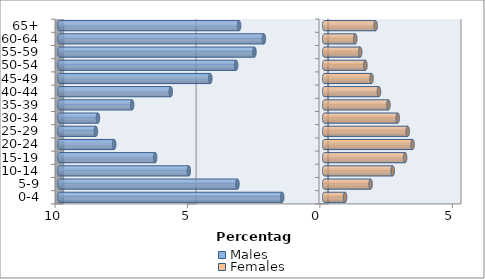
| Category | Males | Females |
|---|---|---|
| 0-4 | -1.587 | 0.788 |
| 5-9 | -3.276 | 1.753 |
| 10-14 | -5.112 | 2.586 |
| 15-19 | -6.383 | 3.054 |
| 20-24 | -7.93 | 3.338 |
| 25-29 | -8.62 | 3.152 |
| 30-34 | -8.542 | 2.775 |
| 35-39 | -7.252 | 2.424 |
| 40-44 | -5.793 | 2.067 |
| 45-49 | -4.302 | 1.787 |
| 50-54 | -3.325 | 1.555 |
| 55-59 | -2.634 | 1.358 |
| 60-64 | -2.277 | 1.172 |
| 65+ | -3.213 | 1.943 |